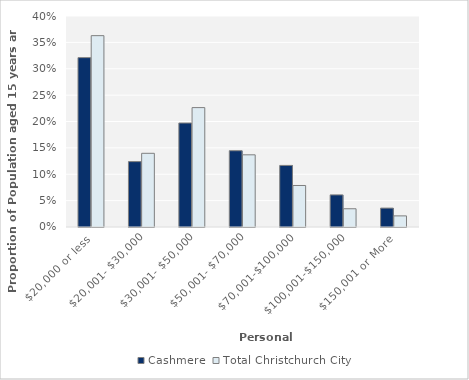
| Category | Cashmere | Total Christchurch City |
|---|---|---|
| $20,000 or less | 0.321 | 0.363 |
| $20,001- $30,000 | 0.124 | 0.14 |
| $30,001- $50,000 | 0.197 | 0.226 |
| $50,001- $70,000 | 0.145 | 0.137 |
| $70,001-$100,000 | 0.117 | 0.079 |
| $100,001-$150,000 | 0.061 | 0.035 |
| $150,001 or More | 0.036 | 0.021 |